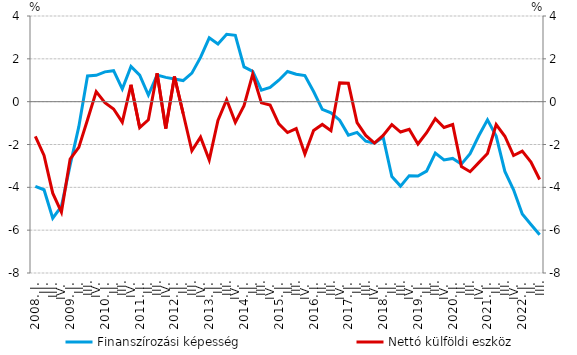
| Category | Finanszírozási képesség |
|---|---|
| 2008. I. | -3.953 |
| II. | -4.112 |
| III. | -5.443 |
| IV. | -4.887 |
| 2009. I. | -2.965 |
|          II. | -1.167 |
|          III. | 1.198 |
|          IV. | 1.232 |
| 2010. I. | 1.391 |
|          II. | 1.447 |
|          III. | 0.595 |
|          IV. | 1.644 |
| 2011. I. | 1.242 |
|          II. | 0.31 |
|          III. | 1.245 |
|          IV. | 1.135 |
| 2012. I. | 1.062 |
|          II. | 0.987 |
|          III. | 1.332 |
|          IV. | 2.065 |
| 2013. I. | 2.984 |
| II. | 2.69 |
|          III. | 3.148 |
| IV. | 3.097 |
| 2014. I. | 1.624 |
| II. | 1.411 |
|          III. | 0.536 |
| IV. | 0.663 |
| 2015. I. | 1 |
| II. | 1.41 |
|          III. | 1.283 |
| IV. | 1.215 |
| 2016. I. | 0.473 |
| II. | -0.357 |
|          III. | -0.519 |
| IV. | -0.866 |
| 2017. I. | -1.562 |
| II. | -1.435 |
|          III. | -1.848 |
| IV. | -1.94 |
| 2018. I. | -1.657 |
| II. | -3.495 |
|          III. | -3.943 |
| IV. | -3.455 |
| 2019. I. | -3.47 |
| II. | -3.246 |
|          III. | -2.404 |
| IV. | -2.722 |
| 2020. I. | -2.65 |
| II. | -2.917 |
|          III. | -2.429 |
| IV. | -1.594 |
| 2021. I. | -0.847 |
| II. | -1.605 |
|          III. | -3.257 |
| IV. | -4.117 |
| 2022. I. | -5.247 |
| II. | -5.734 |
|          III. | -6.217 |